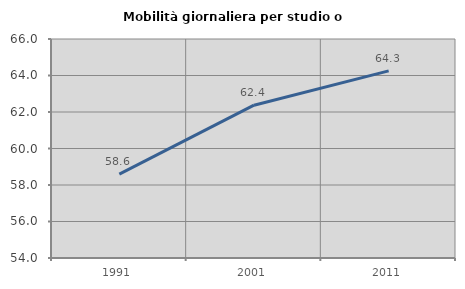
| Category | Mobilità giornaliera per studio o lavoro |
|---|---|
| 1991.0 | 58.595 |
| 2001.0 | 62.373 |
| 2011.0 | 64.255 |